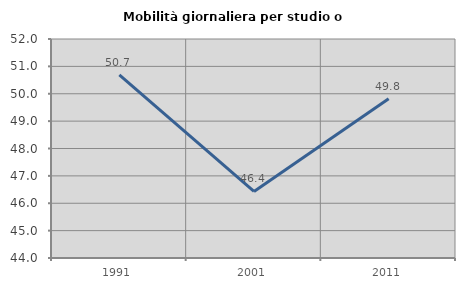
| Category | Mobilità giornaliera per studio o lavoro |
|---|---|
| 1991.0 | 50.693 |
| 2001.0 | 46.43 |
| 2011.0 | 49.816 |